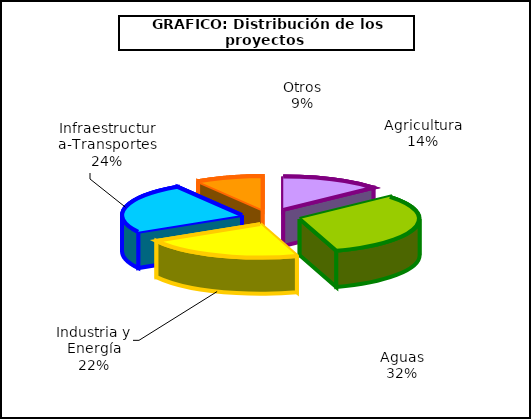
| Category | Series 0 |
|---|---|
| 0 | 1160 |
| 1 | 2701 |
| 2 | 1849 |
| 3 | 2085 |
| 4 | 774 |